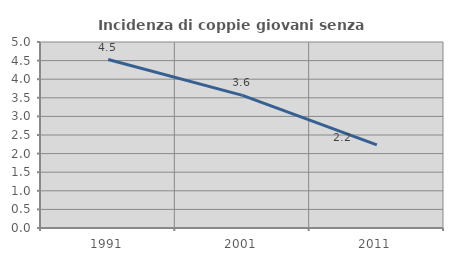
| Category | Incidenza di coppie giovani senza figli |
|---|---|
| 1991.0 | 4.528 |
| 2001.0 | 3.566 |
| 2011.0 | 2.235 |